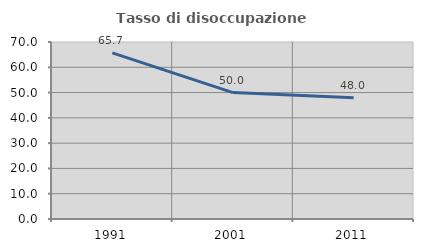
| Category | Tasso di disoccupazione giovanile  |
|---|---|
| 1991.0 | 65.672 |
| 2001.0 | 50 |
| 2011.0 | 48 |